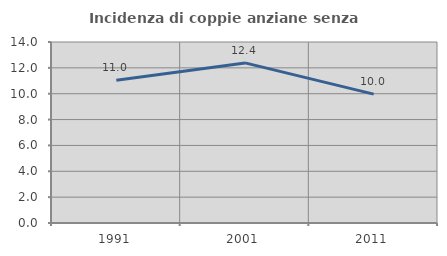
| Category | Incidenza di coppie anziane senza figli  |
|---|---|
| 1991.0 | 11.039 |
| 2001.0 | 12.384 |
| 2011.0 | 9.971 |